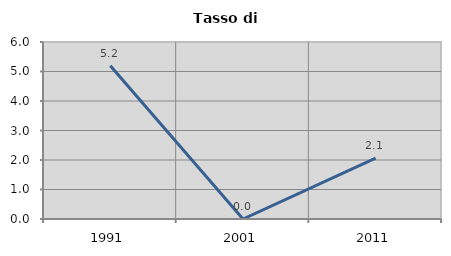
| Category | Tasso di disoccupazione   |
|---|---|
| 1991.0 | 5.195 |
| 2001.0 | 0 |
| 2011.0 | 2.062 |